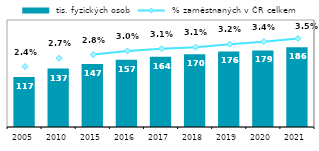
| Category |  tis. fyzických osob |
|---|---|
| 2005 | 116.67 |
| 2010 | 136.668 |
| 2015 | 147.389 |
| 2016 | 157.142 |
| 2017 | 164.209 |
| 2018 | 169.722 |
| 2019 | 176.484 |
| 2020 | 178.818 |
| 2021 | 186.201 |